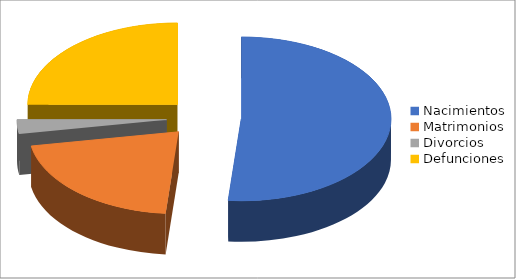
| Category | Series 0 |
|---|---|
| Nacimientos | 37 |
| Matrimonios | 15 |
| Divorcios | 2 |
| Defunciones | 18 |